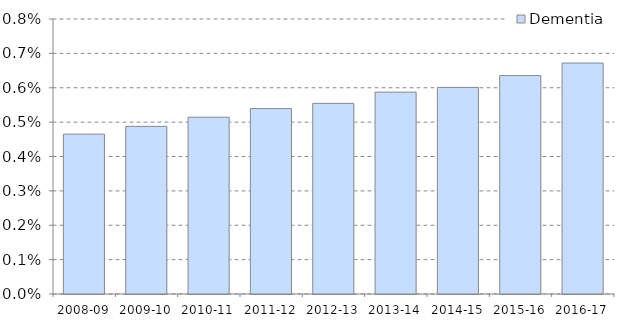
| Category | Dementia |
|---|---|
| 2008-09 | 0.005 |
| 2009-10 | 0.005 |
| 2010-11 | 0.005 |
| 2011-12 | 0.005 |
| 2012-13 | 0.006 |
| 2013-14 | 0.006 |
| 2014-15 | 0.006 |
| 2015-16 | 0.006 |
| 2016-17 | 0.007 |